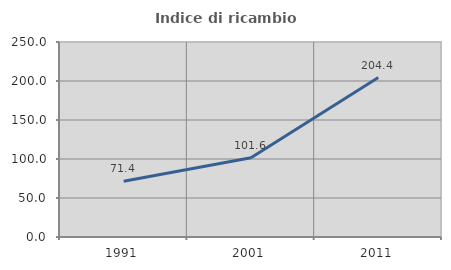
| Category | Indice di ricambio occupazionale  |
|---|---|
| 1991.0 | 71.429 |
| 2001.0 | 101.613 |
| 2011.0 | 204.444 |